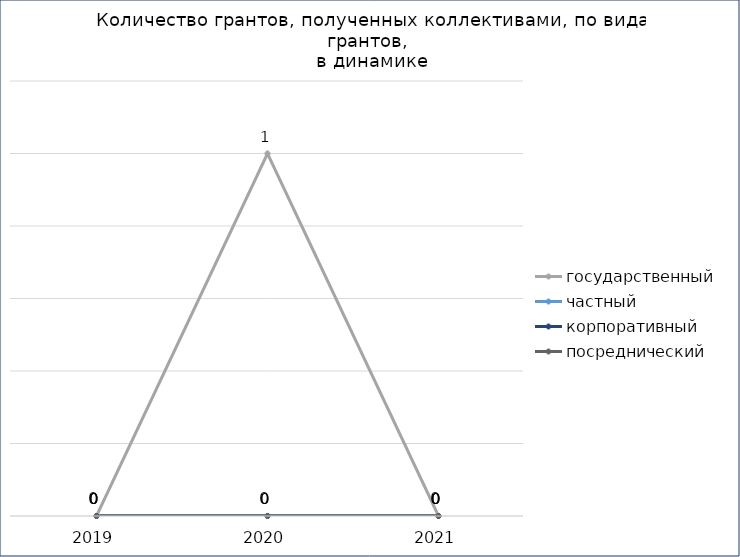
| Category | государственный | частный | корпоративный | посреднический |
|---|---|---|---|---|
| 2019.0 | 0 | 0 | 0 | 0 |
| 2020.0 | 1 | 0 | 0 | 0 |
| 2021.0 | 0 | 0 | 0 | 0 |